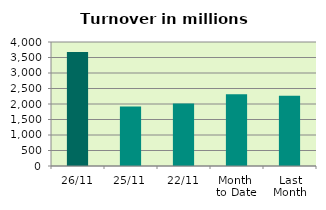
| Category | Series 0 |
|---|---|
| 26/11 | 3679.944 |
| 25/11 | 1918.471 |
| 22/11 | 2017.25 |
| Month 
to Date | 2312.455 |
| Last
Month | 2263.558 |